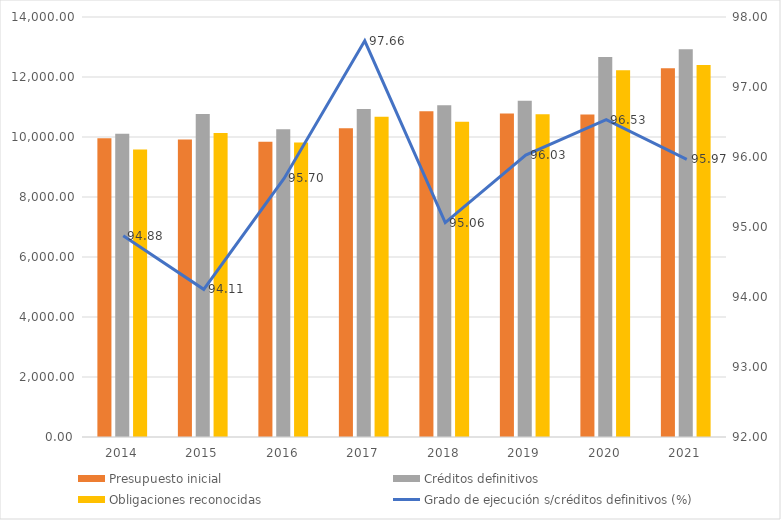
| Category | Presupuesto inicial | Créditos definitivos | Obligaciones reconocidas |
|---|---|---|---|
| 2014.0 | 9957.791 | 10105.328 | 9587.465 |
| 2015.0 | 9920.812 | 10763.44 | 10129.37 |
| 2016.0 | 9843.699 | 10256.08 | 9814.755 |
| 2017.0 | 10293.186 | 10933.955 | 10678.117 |
| 2018.0 | 10859.22 | 11055.9 | 10509.97 |
| 2019.0 | 10784.98 | 11204.58 | 10759.35 |
| 2020.0 | 10752.61 | 12666.41 | 12227.32 |
| 2021.0 | 12291.44 | 12922.55 | 12401.24 |